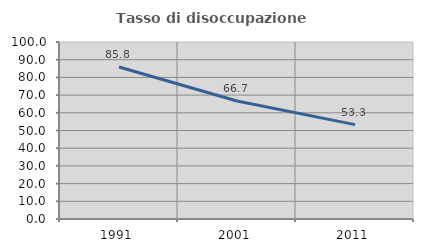
| Category | Tasso di disoccupazione giovanile  |
|---|---|
| 1991.0 | 85.849 |
| 2001.0 | 66.667 |
| 2011.0 | 53.333 |